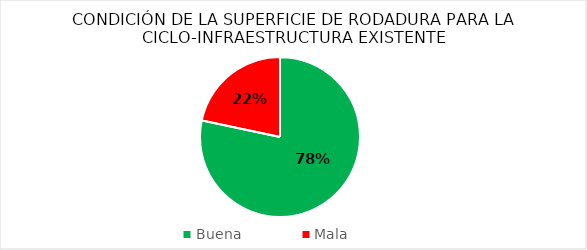
| Category | Series 0 |
|---|---|
| Buena  | 78.334 |
| Mala | 21.666 |